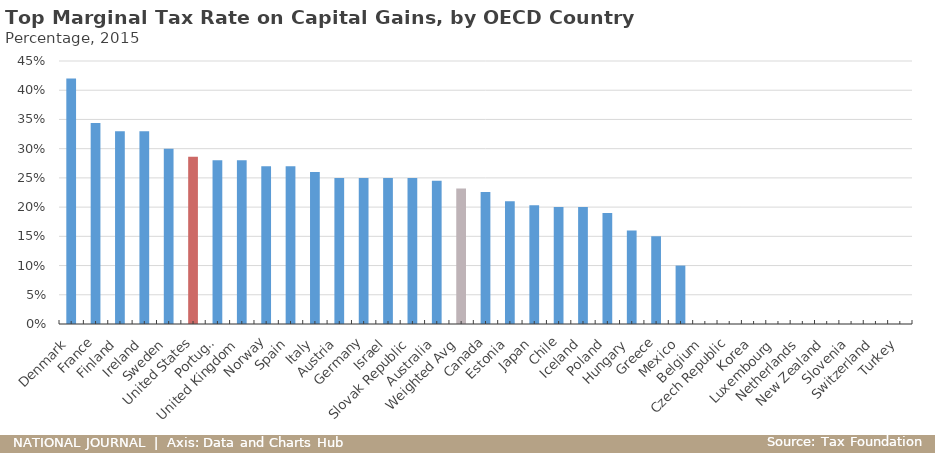
| Category | Top Marginal Rate |
|---|---|
| Denmark | 0.42 |
| France | 0.344 |
| Finland | 0.33 |
| Ireland | 0.33 |
| Sweden | 0.3 |
| United States | 0.286 |
| Portugal | 0.28 |
| United Kingdom | 0.28 |
| Norway | 0.27 |
| Spain | 0.27 |
| Italy | 0.26 |
| Austria | 0.25 |
| Germany | 0.25 |
| Israel | 0.25 |
| Slovak Republic | 0.25 |
| Australia | 0.245 |
| Weighted Avg | 0.232 |
| Canada | 0.226 |
| Estonia | 0.21 |
| Japan | 0.203 |
| Chile | 0.2 |
| Iceland | 0.2 |
| Poland | 0.19 |
| Hungary | 0.16 |
| Greece | 0.15 |
| Mexico | 0.1 |
| Belgium | 0 |
| Czech Republic | 0 |
| Korea | 0 |
| Luxembourg | 0 |
| Netherlands | 0 |
| New Zealand | 0 |
| Slovenia | 0 |
| Switzerland | 0 |
| Turkey | 0 |